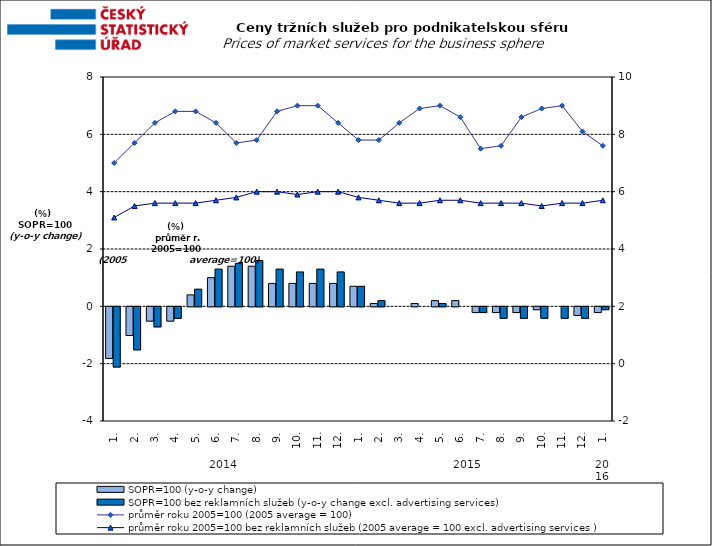
| Category | SOPR=100 (y-o-y change)   | SOPR=100 bez reklamních služeb (y-o-y change excl. advertising services)   |
|---|---|---|
| 0 | -1.8 | -2.1 |
| 1 | -1 | -1.5 |
| 2 | -0.5 | -0.7 |
| 3 | -0.5 | -0.4 |
| 4 | 0.4 | 0.6 |
| 5 | 1 | 1.3 |
| 6 | 1.4 | 1.5 |
| 7 | 1.4 | 1.6 |
| 8 | 0.8 | 1.3 |
| 9 | 0.8 | 1.2 |
| 10 | 0.8 | 1.3 |
| 11 | 0.8 | 1.2 |
| 12 | 0.7 | 0.7 |
| 13 | 0.1 | 0.2 |
| 14 | 0 | 0 |
| 15 | 0.1 | 0 |
| 16 | 0.2 | 0.1 |
| 17 | 0.2 | 0 |
| 18 | -0.2 | -0.2 |
| 19 | -0.2 | -0.4 |
| 20 | -0.2 | -0.4 |
| 21 | -0.1 | -0.4 |
| 22 | 0 | -0.4 |
| 23 | -0.3 | -0.4 |
| 24 | -0.2 | -0.1 |